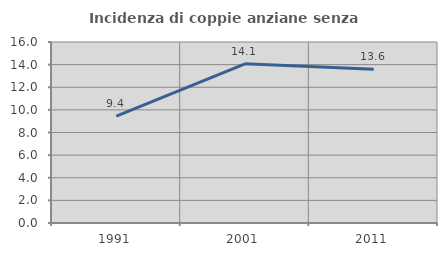
| Category | Incidenza di coppie anziane senza figli  |
|---|---|
| 1991.0 | 9.449 |
| 2001.0 | 14.074 |
| 2011.0 | 13.592 |